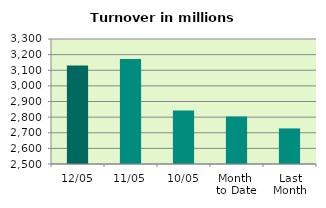
| Category | Series 0 |
|---|---|
| 12/05 | 3130.7 |
| 11/05 | 3171.567 |
| 10/05 | 2842.025 |
| Month 
to Date | 2803.222 |
| Last
Month | 2727.753 |